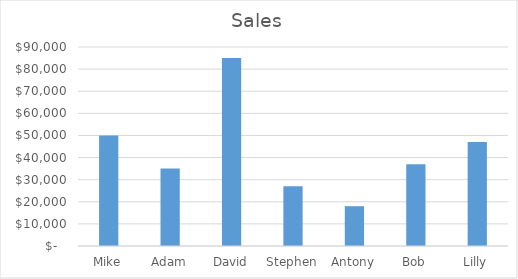
| Category | Sales |
|---|---|
| Mike | 50000 |
| Adam | 35000 |
| David | 85000 |
| Stephen | 27000 |
| Antony | 18000 |
| Bob | 37000 |
| Lilly | 47000 |